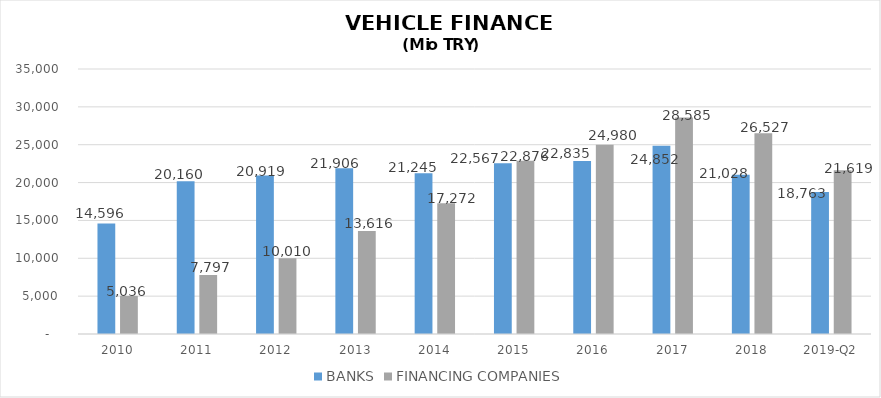
| Category | BANKS | FINANCING COMPANIES |
|---|---|---|
| 2010 | 14596 | 5035.89 |
| 2011 | 20160 | 7796.854 |
| 2012 | 20919 | 10009.755 |
| 2013 | 21906 | 13616.036 |
| 2014 | 21245 | 17271.844 |
| 2015 | 22567 | 22875.563 |
| 2016 | 22835 | 24980.231 |
| 2017 | 24852 | 28584.938 |
| 2018 | 21028 | 26527.133 |
| 2019-Q2 | 18763 | 21618.528 |